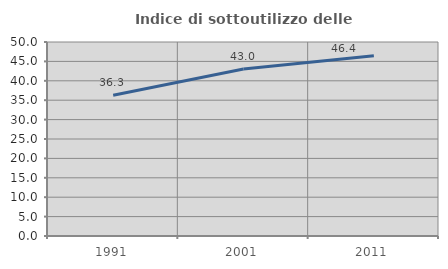
| Category | Indice di sottoutilizzo delle abitazioni  |
|---|---|
| 1991.0 | 36.269 |
| 2001.0 | 43.022 |
| 2011.0 | 46.448 |